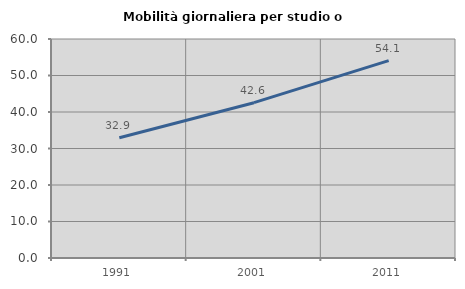
| Category | Mobilità giornaliera per studio o lavoro |
|---|---|
| 1991.0 | 32.937 |
| 2001.0 | 42.553 |
| 2011.0 | 54.07 |